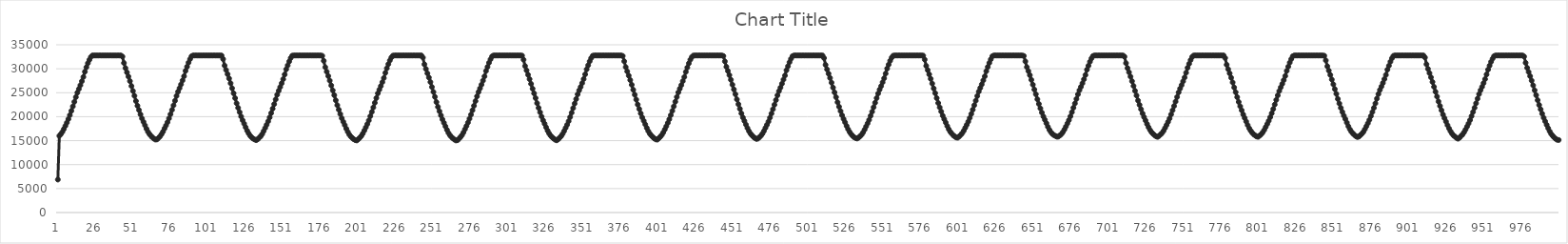
| Category | Series 0 |
|---|---|
| 0 | 6877 |
| 1 | 16004 |
| 2 | 16358 |
| 3 | 16818 |
| 4 | 17420 |
| 5 | 18070 |
| 6 | 18746 |
| 7 | 19490 |
| 8 | 20322 |
| 9 | 21216 |
| 10 | 22145 |
| 11 | 23096 |
| 12 | 24079 |
| 13 | 25020 |
| 14 | 25789 |
| 15 | 26561 |
| 16 | 27403 |
| 17 | 28294 |
| 18 | 29387 |
| 19 | 30323 |
| 20 | 31153 |
| 21 | 31854 |
| 22 | 32469 |
| 23 | 32760 |
| 24 | 32767 |
| 25 | 32767 |
| 26 | 32767 |
| 27 | 32767 |
| 28 | 32767 |
| 29 | 32767 |
| 30 | 32767 |
| 31 | 32767 |
| 32 | 32767 |
| 33 | 32767 |
| 34 | 32767 |
| 35 | 32767 |
| 36 | 32767 |
| 37 | 32767 |
| 38 | 32767 |
| 39 | 32767 |
| 40 | 32767 |
| 41 | 32767 |
| 42 | 32767 |
| 43 | 32542 |
| 44 | 31202 |
| 45 | 30128 |
| 46 | 29246 |
| 47 | 28383 |
| 48 | 27420 |
| 49 | 26400 |
| 50 | 25366 |
| 51 | 24358 |
| 52 | 23261 |
| 53 | 22280 |
| 54 | 21387 |
| 55 | 20486 |
| 56 | 19632 |
| 57 | 18923 |
| 58 | 18210 |
| 59 | 17487 |
| 60 | 16835 |
| 61 | 16353 |
| 62 | 15992 |
| 63 | 15659 |
| 64 | 15408 |
| 65 | 15226 |
| 66 | 15261 |
| 67 | 15567 |
| 68 | 15886 |
| 69 | 16326 |
| 70 | 16876 |
| 71 | 17527 |
| 72 | 18171 |
| 73 | 18853 |
| 74 | 19642 |
| 75 | 20508 |
| 76 | 21417 |
| 77 | 22353 |
| 78 | 23323 |
| 79 | 24328 |
| 80 | 25215 |
| 81 | 25957 |
| 82 | 26730 |
| 83 | 27568 |
| 84 | 28442 |
| 85 | 29567 |
| 86 | 30422 |
| 87 | 31274 |
| 88 | 32003 |
| 89 | 32611 |
| 90 | 32767 |
| 91 | 32767 |
| 92 | 32767 |
| 93 | 32767 |
| 94 | 32767 |
| 95 | 32767 |
| 96 | 32767 |
| 97 | 32767 |
| 98 | 32767 |
| 99 | 32767 |
| 100 | 32767 |
| 101 | 32767 |
| 102 | 32767 |
| 103 | 32767 |
| 104 | 32767 |
| 105 | 32767 |
| 106 | 32767 |
| 107 | 32767 |
| 108 | 32767 |
| 109 | 32754 |
| 110 | 32029 |
| 111 | 30653 |
| 112 | 29734 |
| 113 | 28867 |
| 114 | 27974 |
| 115 | 26974 |
| 116 | 25919 |
| 117 | 24883 |
| 118 | 23867 |
| 119 | 22790 |
| 120 | 21845 |
| 121 | 20934 |
| 122 | 20038 |
| 123 | 19255 |
| 124 | 18547 |
| 125 | 17796 |
| 126 | 17098 |
| 127 | 16504 |
| 128 | 16032 |
| 129 | 15681 |
| 130 | 15420 |
| 131 | 15245 |
| 132 | 15104 |
| 133 | 15280 |
| 134 | 15604 |
| 135 | 15908 |
| 136 | 16363 |
| 137 | 16976 |
| 138 | 17640 |
| 139 | 18321 |
| 140 | 19041 |
| 141 | 19844 |
| 142 | 20746 |
| 143 | 21673 |
| 144 | 22622 |
| 145 | 23610 |
| 146 | 24579 |
| 147 | 25416 |
| 148 | 26177 |
| 149 | 26978 |
| 150 | 27824 |
| 151 | 28807 |
| 152 | 29885 |
| 153 | 30703 |
| 154 | 31515 |
| 155 | 32244 |
| 156 | 32724 |
| 157 | 32767 |
| 158 | 32767 |
| 159 | 32767 |
| 160 | 32767 |
| 161 | 32767 |
| 162 | 32767 |
| 163 | 32767 |
| 164 | 32767 |
| 165 | 32767 |
| 166 | 32767 |
| 167 | 32767 |
| 168 | 32767 |
| 169 | 32767 |
| 170 | 32767 |
| 171 | 32767 |
| 172 | 32767 |
| 173 | 32767 |
| 174 | 32767 |
| 175 | 32767 |
| 176 | 32702 |
| 177 | 31648 |
| 178 | 30314 |
| 179 | 29379 |
| 180 | 28473 |
| 181 | 27525 |
| 182 | 26511 |
| 183 | 25484 |
| 184 | 24483 |
| 185 | 23425 |
| 186 | 22389 |
| 187 | 21461 |
| 188 | 20550 |
| 189 | 19672 |
| 190 | 18938 |
| 191 | 18242 |
| 192 | 17499 |
| 193 | 16834 |
| 194 | 16274 |
| 195 | 15855 |
| 196 | 15560 |
| 197 | 15295 |
| 198 | 15102 |
| 199 | 15042 |
| 200 | 15298 |
| 201 | 15609 |
| 202 | 15973 |
| 203 | 16489 |
| 204 | 17100 |
| 205 | 17774 |
| 206 | 18464 |
| 207 | 19221 |
| 208 | 20099 |
| 209 | 20997 |
| 210 | 21931 |
| 211 | 22899 |
| 212 | 23896 |
| 213 | 24865 |
| 214 | 25632 |
| 215 | 26388 |
| 216 | 27208 |
| 217 | 28068 |
| 218 | 29148 |
| 219 | 30100 |
| 220 | 30969 |
| 221 | 31734 |
| 222 | 32356 |
| 223 | 32734 |
| 224 | 32767 |
| 225 | 32767 |
| 226 | 32767 |
| 227 | 32767 |
| 228 | 32767 |
| 229 | 32767 |
| 230 | 32767 |
| 231 | 32767 |
| 232 | 32767 |
| 233 | 32767 |
| 234 | 32767 |
| 235 | 32767 |
| 236 | 32767 |
| 237 | 32767 |
| 238 | 32767 |
| 239 | 32767 |
| 240 | 32767 |
| 241 | 32767 |
| 242 | 32767 |
| 243 | 32335 |
| 244 | 30920 |
| 245 | 29953 |
| 246 | 29039 |
| 247 | 28172 |
| 248 | 27226 |
| 249 | 26198 |
| 250 | 25156 |
| 251 | 24135 |
| 252 | 23042 |
| 253 | 22046 |
| 254 | 21127 |
| 255 | 20262 |
| 256 | 19443 |
| 257 | 18723 |
| 258 | 17991 |
| 259 | 17255 |
| 260 | 16624 |
| 261 | 16121 |
| 262 | 15765 |
| 263 | 15465 |
| 264 | 15225 |
| 265 | 15043 |
| 266 | 15086 |
| 267 | 15398 |
| 268 | 15735 |
| 269 | 16154 |
| 270 | 16714 |
| 271 | 17387 |
| 272 | 18063 |
| 273 | 18771 |
| 274 | 19574 |
| 275 | 20434 |
| 276 | 21344 |
| 277 | 22277 |
| 278 | 23249 |
| 279 | 24247 |
| 280 | 25152 |
| 281 | 25906 |
| 282 | 26675 |
| 283 | 27527 |
| 284 | 28418 |
| 285 | 29545 |
| 286 | 30384 |
| 287 | 31247 |
| 288 | 31968 |
| 289 | 32574 |
| 290 | 32767 |
| 291 | 32767 |
| 292 | 32767 |
| 293 | 32767 |
| 294 | 32767 |
| 295 | 32767 |
| 296 | 32767 |
| 297 | 32767 |
| 298 | 32767 |
| 299 | 32767 |
| 300 | 32767 |
| 301 | 32767 |
| 302 | 32767 |
| 303 | 32767 |
| 304 | 32767 |
| 305 | 32767 |
| 306 | 32767 |
| 307 | 32767 |
| 308 | 32767 |
| 309 | 32738 |
| 310 | 31889 |
| 311 | 30570 |
| 312 | 29665 |
| 313 | 28748 |
| 314 | 27836 |
| 315 | 26844 |
| 316 | 25847 |
| 317 | 24857 |
| 318 | 23879 |
| 319 | 22812 |
| 320 | 21843 |
| 321 | 20922 |
| 322 | 20034 |
| 323 | 19241 |
| 324 | 18531 |
| 325 | 17786 |
| 326 | 17090 |
| 327 | 16502 |
| 328 | 16047 |
| 329 | 15704 |
| 330 | 15445 |
| 331 | 15207 |
| 332 | 15068 |
| 333 | 15271 |
| 334 | 15595 |
| 335 | 15927 |
| 336 | 16401 |
| 337 | 17000 |
| 338 | 17652 |
| 339 | 18315 |
| 340 | 19061 |
| 341 | 19909 |
| 342 | 20829 |
| 343 | 21777 |
| 344 | 22734 |
| 345 | 23677 |
| 346 | 24665 |
| 347 | 25494 |
| 348 | 26211 |
| 349 | 27007 |
| 350 | 27854 |
| 351 | 28834 |
| 352 | 29890 |
| 353 | 30723 |
| 354 | 31552 |
| 355 | 32231 |
| 356 | 32709 |
| 357 | 32767 |
| 358 | 32767 |
| 359 | 32767 |
| 360 | 32767 |
| 361 | 32767 |
| 362 | 32767 |
| 363 | 32767 |
| 364 | 32767 |
| 365 | 32767 |
| 366 | 32767 |
| 367 | 32767 |
| 368 | 32767 |
| 369 | 32767 |
| 370 | 32767 |
| 371 | 32767 |
| 372 | 32767 |
| 373 | 32767 |
| 374 | 32767 |
| 375 | 32767 |
| 376 | 32676 |
| 377 | 31562 |
| 378 | 30343 |
| 379 | 29439 |
| 380 | 28562 |
| 381 | 27640 |
| 382 | 26656 |
| 383 | 25608 |
| 384 | 24596 |
| 385 | 23563 |
| 386 | 22526 |
| 387 | 21594 |
| 388 | 20683 |
| 389 | 19849 |
| 390 | 19137 |
| 391 | 18405 |
| 392 | 17661 |
| 393 | 17000 |
| 394 | 16470 |
| 395 | 16072 |
| 396 | 15745 |
| 397 | 15466 |
| 398 | 15263 |
| 399 | 15213 |
| 400 | 15507 |
| 401 | 15817 |
| 402 | 16185 |
| 403 | 16709 |
| 404 | 17318 |
| 405 | 17987 |
| 406 | 18692 |
| 407 | 19463 |
| 408 | 20315 |
| 409 | 21207 |
| 410 | 22134 |
| 411 | 23122 |
| 412 | 24104 |
| 413 | 25061 |
| 414 | 25838 |
| 415 | 26590 |
| 416 | 27413 |
| 417 | 28272 |
| 418 | 29357 |
| 419 | 30261 |
| 420 | 31120 |
| 421 | 31891 |
| 422 | 32449 |
| 423 | 32749 |
| 424 | 32767 |
| 425 | 32767 |
| 426 | 32767 |
| 427 | 32767 |
| 428 | 32767 |
| 429 | 32767 |
| 430 | 32767 |
| 431 | 32767 |
| 432 | 32767 |
| 433 | 32767 |
| 434 | 32767 |
| 435 | 32767 |
| 436 | 32767 |
| 437 | 32767 |
| 438 | 32767 |
| 439 | 32767 |
| 440 | 32767 |
| 441 | 32767 |
| 442 | 32767 |
| 443 | 32661 |
| 444 | 31537 |
| 445 | 30405 |
| 446 | 29546 |
| 447 | 28673 |
| 448 | 27701 |
| 449 | 26679 |
| 450 | 25682 |
| 451 | 24690 |
| 452 | 23607 |
| 453 | 22605 |
| 454 | 21639 |
| 455 | 20680 |
| 456 | 19829 |
| 457 | 19106 |
| 458 | 18350 |
| 459 | 17626 |
| 460 | 17004 |
| 461 | 16494 |
| 462 | 16105 |
| 463 | 15782 |
| 464 | 15538 |
| 465 | 15361 |
| 466 | 15433 |
| 467 | 15728 |
| 468 | 16029 |
| 469 | 16449 |
| 470 | 17015 |
| 471 | 17653 |
| 472 | 18306 |
| 473 | 18985 |
| 474 | 19779 |
| 475 | 20653 |
| 476 | 21555 |
| 477 | 22493 |
| 478 | 23469 |
| 479 | 24455 |
| 480 | 25339 |
| 481 | 26072 |
| 482 | 26876 |
| 483 | 27736 |
| 484 | 28598 |
| 485 | 29697 |
| 486 | 30521 |
| 487 | 31366 |
| 488 | 32074 |
| 489 | 32624 |
| 490 | 32767 |
| 491 | 32767 |
| 492 | 32767 |
| 493 | 32767 |
| 494 | 32767 |
| 495 | 32767 |
| 496 | 32767 |
| 497 | 32767 |
| 498 | 32767 |
| 499 | 32767 |
| 500 | 32767 |
| 501 | 32767 |
| 502 | 32767 |
| 503 | 32767 |
| 504 | 32767 |
| 505 | 32767 |
| 506 | 32767 |
| 507 | 32767 |
| 508 | 32767 |
| 509 | 32765 |
| 510 | 32226 |
| 511 | 30814 |
| 512 | 29861 |
| 513 | 28978 |
| 514 | 28086 |
| 515 | 27094 |
| 516 | 26066 |
| 517 | 25064 |
| 518 | 24076 |
| 519 | 23011 |
| 520 | 22083 |
| 521 | 21178 |
| 522 | 20289 |
| 523 | 19528 |
| 524 | 18829 |
| 525 | 18084 |
| 526 | 17396 |
| 527 | 16825 |
| 528 | 16371 |
| 529 | 16014 |
| 530 | 15728 |
| 531 | 15543 |
| 532 | 15449 |
| 533 | 15625 |
| 534 | 15923 |
| 535 | 16234 |
| 536 | 16716 |
| 537 | 17293 |
| 538 | 17965 |
| 539 | 18622 |
| 540 | 19336 |
| 541 | 20171 |
| 542 | 21033 |
| 543 | 21956 |
| 544 | 22910 |
| 545 | 23875 |
| 546 | 24831 |
| 547 | 25651 |
| 548 | 26383 |
| 549 | 27182 |
| 550 | 28015 |
| 551 | 29002 |
| 552 | 30044 |
| 553 | 30859 |
| 554 | 31672 |
| 555 | 32307 |
| 556 | 32723 |
| 557 | 32767 |
| 558 | 32767 |
| 559 | 32767 |
| 560 | 32767 |
| 561 | 32767 |
| 562 | 32767 |
| 563 | 32767 |
| 564 | 32767 |
| 565 | 32767 |
| 566 | 32767 |
| 567 | 32767 |
| 568 | 32767 |
| 569 | 32767 |
| 570 | 32767 |
| 571 | 32767 |
| 572 | 32767 |
| 573 | 32767 |
| 574 | 32767 |
| 575 | 32767 |
| 576 | 32742 |
| 577 | 31917 |
| 578 | 30600 |
| 579 | 29713 |
| 580 | 28835 |
| 581 | 27905 |
| 582 | 26911 |
| 583 | 25891 |
| 584 | 24903 |
| 585 | 23880 |
| 586 | 22859 |
| 587 | 21942 |
| 588 | 21068 |
| 589 | 20206 |
| 590 | 19475 |
| 591 | 18775 |
| 592 | 18046 |
| 593 | 17388 |
| 594 | 16855 |
| 595 | 16467 |
| 596 | 16130 |
| 597 | 15861 |
| 598 | 15662 |
| 599 | 15618 |
| 600 | 15906 |
| 601 | 16209 |
| 602 | 16566 |
| 603 | 17075 |
| 604 | 17685 |
| 605 | 18310 |
| 606 | 18974 |
| 607 | 19736 |
| 608 | 20578 |
| 609 | 21462 |
| 610 | 22389 |
| 611 | 23340 |
| 612 | 24306 |
| 613 | 25233 |
| 614 | 25998 |
| 615 | 26750 |
| 616 | 27576 |
| 617 | 28423 |
| 618 | 29501 |
| 619 | 30380 |
| 620 | 31210 |
| 621 | 31968 |
| 622 | 32606 |
| 623 | 32767 |
| 624 | 32767 |
| 625 | 32767 |
| 626 | 32767 |
| 627 | 32767 |
| 628 | 32767 |
| 629 | 32767 |
| 630 | 32767 |
| 631 | 32767 |
| 632 | 32767 |
| 633 | 32767 |
| 634 | 32767 |
| 635 | 32767 |
| 636 | 32767 |
| 637 | 32767 |
| 638 | 32767 |
| 639 | 32767 |
| 640 | 32767 |
| 641 | 32767 |
| 642 | 32767 |
| 643 | 32668 |
| 644 | 31534 |
| 645 | 30348 |
| 646 | 29508 |
| 647 | 28662 |
| 648 | 27681 |
| 649 | 26687 |
| 650 | 25660 |
| 651 | 24685 |
| 652 | 23635 |
| 653 | 22664 |
| 654 | 21736 |
| 655 | 20856 |
| 656 | 20041 |
| 657 | 19349 |
| 658 | 18638 |
| 659 | 17887 |
| 660 | 17275 |
| 661 | 16776 |
| 662 | 16404 |
| 663 | 16160 |
| 664 | 15991 |
| 665 | 15824 |
| 666 | 15844 |
| 667 | 16098 |
| 668 | 16380 |
| 669 | 16778 |
| 670 | 17317 |
| 671 | 17949 |
| 672 | 18602 |
| 673 | 19283 |
| 674 | 20071 |
| 675 | 20943 |
| 676 | 21865 |
| 677 | 22773 |
| 678 | 23703 |
| 679 | 24655 |
| 680 | 25521 |
| 681 | 26236 |
| 682 | 26979 |
| 683 | 27809 |
| 684 | 28698 |
| 685 | 29810 |
| 686 | 30630 |
| 687 | 31474 |
| 688 | 32158 |
| 689 | 32659 |
| 690 | 32767 |
| 691 | 32767 |
| 692 | 32767 |
| 693 | 32767 |
| 694 | 32767 |
| 695 | 32767 |
| 696 | 32767 |
| 697 | 32767 |
| 698 | 32767 |
| 699 | 32767 |
| 700 | 32767 |
| 701 | 32767 |
| 702 | 32767 |
| 703 | 32767 |
| 704 | 32767 |
| 705 | 32767 |
| 706 | 32767 |
| 707 | 32767 |
| 708 | 32767 |
| 709 | 32767 |
| 710 | 32518 |
| 711 | 31167 |
| 712 | 30129 |
| 713 | 29277 |
| 714 | 28375 |
| 715 | 27411 |
| 716 | 26412 |
| 717 | 25407 |
| 718 | 24414 |
| 719 | 23371 |
| 720 | 22467 |
| 721 | 21563 |
| 722 | 20681 |
| 723 | 19916 |
| 724 | 19213 |
| 725 | 18468 |
| 726 | 17802 |
| 727 | 17213 |
| 728 | 16756 |
| 729 | 16424 |
| 730 | 16143 |
| 731 | 15907 |
| 732 | 15786 |
| 733 | 15987 |
| 734 | 16283 |
| 735 | 16595 |
| 736 | 17058 |
| 737 | 17644 |
| 738 | 18272 |
| 739 | 18912 |
| 740 | 19624 |
| 741 | 20463 |
| 742 | 21332 |
| 743 | 22228 |
| 744 | 23156 |
| 745 | 24105 |
| 746 | 25064 |
| 747 | 25869 |
| 748 | 26592 |
| 749 | 27375 |
| 750 | 28187 |
| 751 | 29174 |
| 752 | 30209 |
| 753 | 31029 |
| 754 | 31818 |
| 755 | 32450 |
| 756 | 32754 |
| 757 | 32767 |
| 758 | 32767 |
| 759 | 32767 |
| 760 | 32767 |
| 761 | 32767 |
| 762 | 32767 |
| 763 | 32767 |
| 764 | 32767 |
| 765 | 32767 |
| 766 | 32767 |
| 767 | 32767 |
| 768 | 32767 |
| 769 | 32767 |
| 770 | 32767 |
| 771 | 32767 |
| 772 | 32767 |
| 773 | 32767 |
| 774 | 32767 |
| 775 | 32767 |
| 776 | 32766 |
| 777 | 32249 |
| 778 | 30834 |
| 779 | 29899 |
| 780 | 29040 |
| 781 | 28131 |
| 782 | 27146 |
| 783 | 26087 |
| 784 | 25105 |
| 785 | 24077 |
| 786 | 23076 |
| 787 | 22174 |
| 788 | 21320 |
| 789 | 20466 |
| 790 | 19725 |
| 791 | 18985 |
| 792 | 18238 |
| 793 | 17576 |
| 794 | 17059 |
| 795 | 16649 |
| 796 | 16328 |
| 797 | 16061 |
| 798 | 15864 |
| 799 | 15799 |
| 800 | 16064 |
| 801 | 16356 |
| 802 | 16723 |
| 803 | 17227 |
| 804 | 17843 |
| 805 | 18476 |
| 806 | 19137 |
| 807 | 19891 |
| 808 | 20709 |
| 809 | 21591 |
| 810 | 22541 |
| 811 | 23503 |
| 812 | 24444 |
| 813 | 25358 |
| 814 | 26108 |
| 815 | 26839 |
| 816 | 27636 |
| 817 | 28484 |
| 818 | 29560 |
| 819 | 30441 |
| 820 | 31290 |
| 821 | 32023 |
| 822 | 32615 |
| 823 | 32767 |
| 824 | 32767 |
| 825 | 32767 |
| 826 | 32767 |
| 827 | 32767 |
| 828 | 32767 |
| 829 | 32767 |
| 830 | 32767 |
| 831 | 32767 |
| 832 | 32767 |
| 833 | 32767 |
| 834 | 32767 |
| 835 | 32767 |
| 836 | 32767 |
| 837 | 32767 |
| 838 | 32767 |
| 839 | 32767 |
| 840 | 32767 |
| 841 | 32767 |
| 842 | 32767 |
| 843 | 32711 |
| 844 | 31741 |
| 845 | 30508 |
| 846 | 29616 |
| 847 | 28713 |
| 848 | 27745 |
| 849 | 26752 |
| 850 | 25742 |
| 851 | 24762 |
| 852 | 23693 |
| 853 | 22747 |
| 854 | 21833 |
| 855 | 20980 |
| 856 | 20205 |
| 857 | 19511 |
| 858 | 18762 |
| 859 | 18003 |
| 860 | 17371 |
| 861 | 16866 |
| 862 | 16508 |
| 863 | 16204 |
| 864 | 15930 |
| 865 | 15763 |
| 866 | 15850 |
| 867 | 16145 |
| 868 | 16440 |
| 869 | 16834 |
| 870 | 17387 |
| 871 | 17997 |
| 872 | 18625 |
| 873 | 19330 |
| 874 | 20117 |
| 875 | 20967 |
| 876 | 21843 |
| 877 | 22778 |
| 878 | 23769 |
| 879 | 24726 |
| 880 | 25576 |
| 881 | 26281 |
| 882 | 27031 |
| 883 | 27845 |
| 884 | 28719 |
| 885 | 29821 |
| 886 | 30627 |
| 887 | 31469 |
| 888 | 32185 |
| 889 | 32694 |
| 890 | 32767 |
| 891 | 32767 |
| 892 | 32767 |
| 893 | 32767 |
| 894 | 32767 |
| 895 | 32767 |
| 896 | 32767 |
| 897 | 32767 |
| 898 | 32767 |
| 899 | 32767 |
| 900 | 32767 |
| 901 | 32767 |
| 902 | 32767 |
| 903 | 32767 |
| 904 | 32767 |
| 905 | 32767 |
| 906 | 32767 |
| 907 | 32767 |
| 908 | 32767 |
| 909 | 32767 |
| 910 | 32359 |
| 911 | 30938 |
| 912 | 29973 |
| 913 | 29104 |
| 914 | 28216 |
| 915 | 27248 |
| 916 | 26229 |
| 917 | 25209 |
| 918 | 24207 |
| 919 | 23159 |
| 920 | 22235 |
| 921 | 21329 |
| 922 | 20448 |
| 923 | 19684 |
| 924 | 18972 |
| 925 | 18229 |
| 926 | 17550 |
| 927 | 16963 |
| 928 | 16472 |
| 929 | 16091 |
| 930 | 15834 |
| 931 | 15573 |
| 932 | 15407 |
| 933 | 15624 |
| 934 | 15979 |
| 935 | 16289 |
| 936 | 16739 |
| 937 | 17315 |
| 938 | 17922 |
| 939 | 18573 |
| 940 | 19288 |
| 941 | 20114 |
| 942 | 20974 |
| 943 | 21856 |
| 944 | 22795 |
| 945 | 23763 |
| 946 | 24714 |
| 947 | 25511 |
| 948 | 26225 |
| 949 | 27003 |
| 950 | 27834 |
| 951 | 28809 |
| 952 | 29824 |
| 953 | 30647 |
| 954 | 31448 |
| 955 | 32112 |
| 956 | 32645 |
| 957 | 32767 |
| 958 | 32767 |
| 959 | 32767 |
| 960 | 32767 |
| 961 | 32767 |
| 962 | 32767 |
| 963 | 32767 |
| 964 | 32767 |
| 965 | 32767 |
| 966 | 32767 |
| 967 | 32767 |
| 968 | 32767 |
| 969 | 32767 |
| 970 | 32767 |
| 971 | 32767 |
| 972 | 32767 |
| 973 | 32767 |
| 974 | 32767 |
| 975 | 32767 |
| 976 | 32552 |
| 977 | 31246 |
| 978 | 30201 |
| 979 | 29322 |
| 980 | 28449 |
| 981 | 27527 |
| 982 | 26536 |
| 983 | 25495 |
| 984 | 24494 |
| 985 | 23447 |
| 986 | 22442 |
| 987 | 21530 |
| 988 | 20635 |
| 989 | 19779 |
| 990 | 19041 |
| 991 | 18310 |
| 992 | 17601 |
| 993 | 16951 |
| 994 | 16401 |
| 995 | 16009 |
| 996 | 15661 |
| 997 | 15382 |
| 998 | 15178 |
| 999 | 15137 |